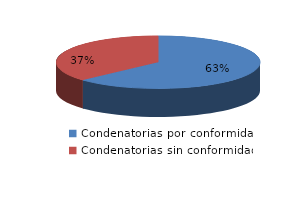
| Category | Series 0 |
|---|---|
| 0 | 96 |
| 1 | 56 |